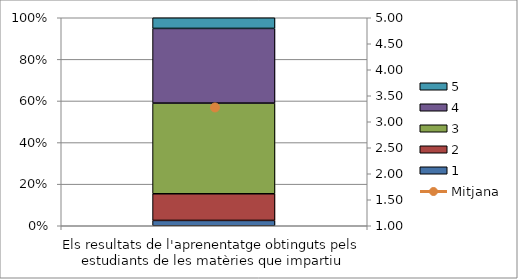
| Category | 1 | 2 | 3 | 4 | 5 |
|---|---|---|---|---|---|
| Els resultats de l'aprenentatge obtinguts pels estudiants de les matèries que impartiu | 1 | 5 | 17 | 14 | 2 |